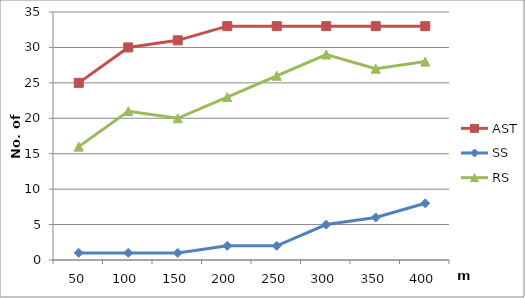
| Category | AST | SS | RS |
|---|---|---|---|
| 50.0 | 25 | 1 | 16 |
| 100.0 | 30 | 1 | 21 |
| 150.0 | 31 | 1 | 20 |
| 200.0 | 33 | 2 | 23 |
| 250.0 | 33 | 2 | 26 |
| 300.0 | 33 | 5 | 29 |
| 350.0 | 33 | 6 | 27 |
| 400.0 | 33 | 8 | 28 |